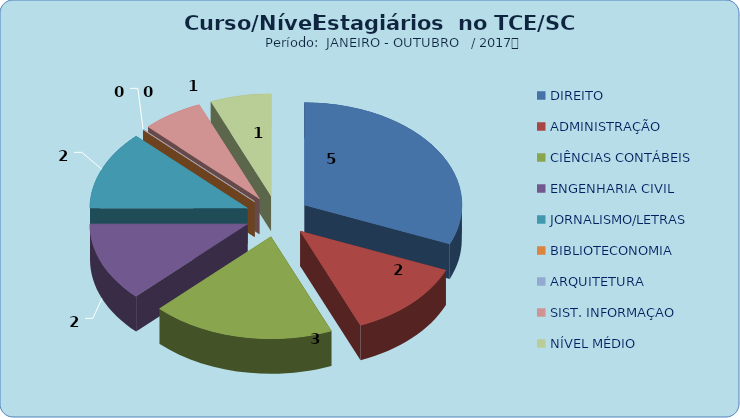
| Category | Series 0 |
|---|---|
| DIREITO | 5 |
| ADMINISTRAÇÃO | 2 |
| CIÊNCIAS CONTÁBEIS | 3 |
| ENGENHARIA CIVIL | 2 |
| JORNALISMO/LETRAS | 2 |
| BIBLIOTECONOMIA | 0 |
| ARQUITETURA | 0 |
| SIST. INFORMAÇAO | 1 |
| NÍVEL MÉDIO | 1 |